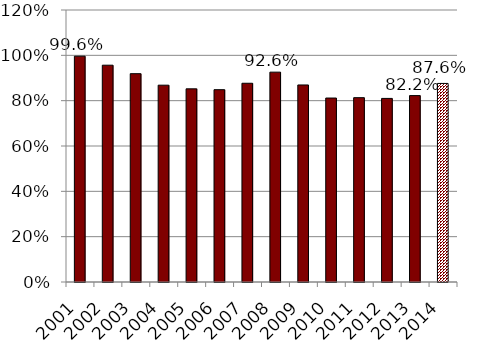
| Category | Series 1 |
|---|---|
| 2001.0 | 0.996 |
| 2002.0 | 0.956 |
| 2003.0 | 0.919 |
| 2004.0 | 0.868 |
| 2005.0 | 0.852 |
| 2006.0 | 0.848 |
| 2007.0 | 0.877 |
| 2008.0 | 0.926 |
| 2009.0 | 0.869 |
| 2010.0 | 0.812 |
| 2011.0 | 0.813 |
| 2012.0 | 0.81 |
| 2013.0 | 0.822 |
| 2014.0 | 0.876 |